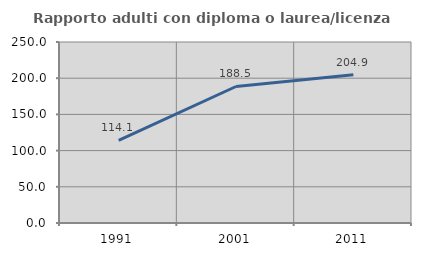
| Category | Rapporto adulti con diploma o laurea/licenza media  |
|---|---|
| 1991.0 | 114.054 |
| 2001.0 | 188.548 |
| 2011.0 | 204.891 |